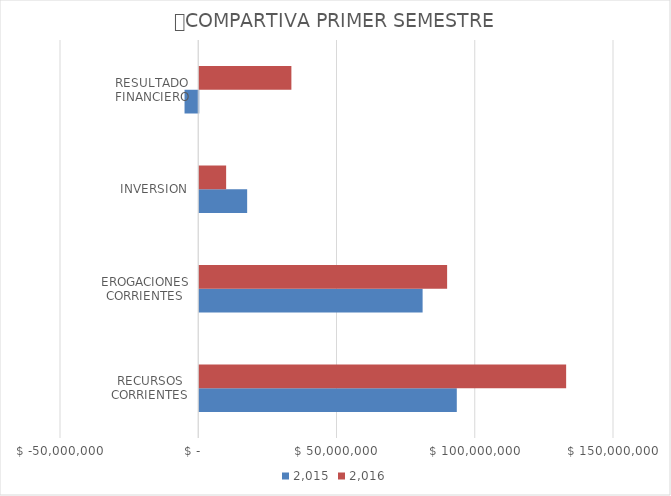
| Category |  2.015  |  2.016  |
|---|---|---|
| RECURSOS CORRIENTES | 93146072.34 | 132691146.91 |
| EROGACIONES CORRIENTES | 80781487.78 | 89644808.92 |
| INVERSION | 17326084.29 | 9725164.72 |
| RESULTADO FINANCIERO | -4961499.73 | 33321173.27 |